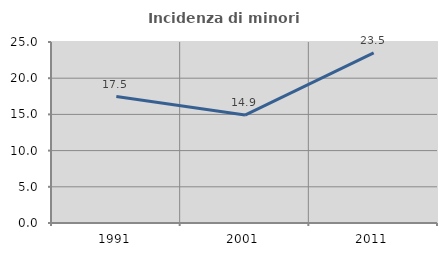
| Category | Incidenza di minori stranieri |
|---|---|
| 1991.0 | 17.46 |
| 2001.0 | 14.909 |
| 2011.0 | 23.496 |